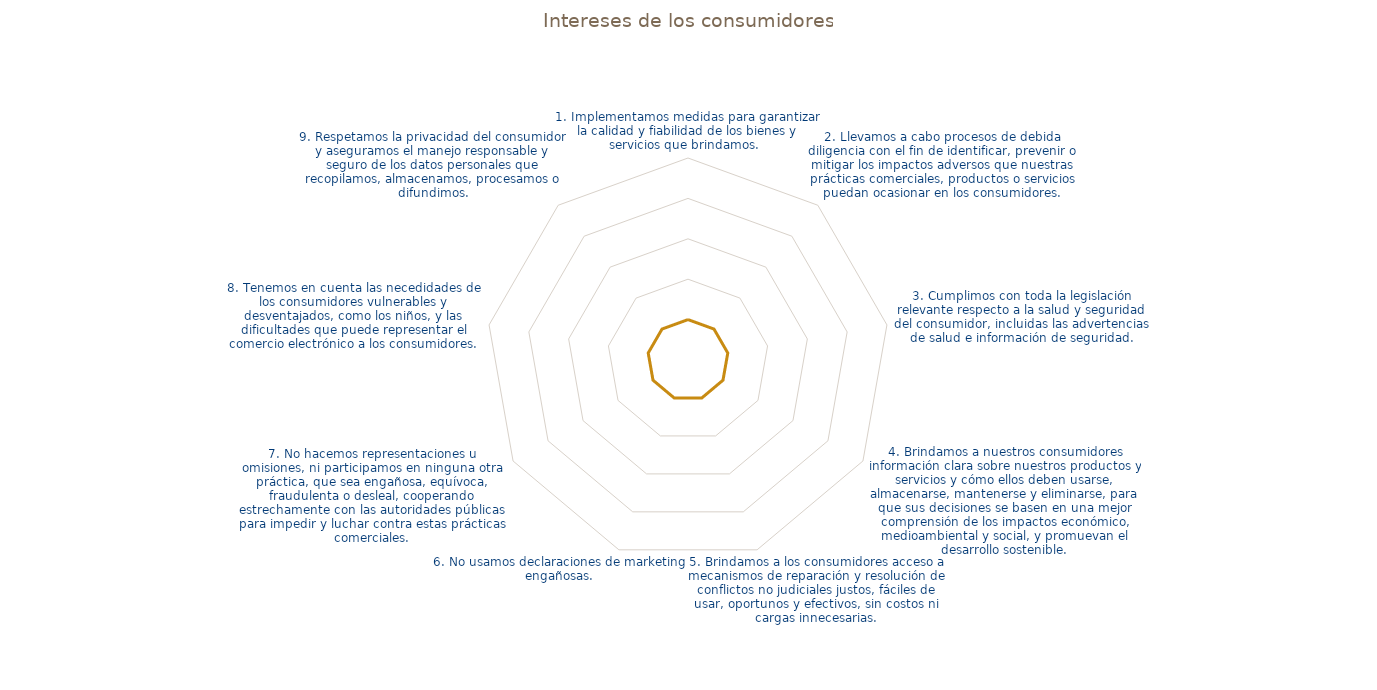
| Category | Series 0 |
|---|---|
| 1. Implementamos medidas para garantizar la calidad y fiabilidad de los bienes y servicios que brindamos.   | 1 |
| 2. Llevamos a cabo procesos de debida diligencia con el fin de identificar, prevenir o mitigar los impactos adversos que nuestras prácticas comerciales, productos o servicios puedan ocasionar en los consumidores. | 1 |
| 3. Cumplimos con toda la legislación relevante respecto a la salud y seguridad del consumidor, incluidas las advertencias de salud e información de seguridad. | 1 |
| 4. Brindamos a nuestros consumidores información clara sobre nuestros productos y servicios y cómo ellos deben usarse, almacenarse, mantenerse y eliminarse, para que sus decisiones se basen en una mejor comprensión de los impactos económico, medioambiental | 1 |
| 5. Brindamos a los consumidores acceso a mecanismos de reparación y resolución de conflictos no judiciales justos, fáciles de usar, oportunos y efectivos, sin costos ni cargas innecesarias. | 1 |
| 6. No usamos declaraciones de marketing engañosas. | 1 |
| 7. No hacemos representaciones u omisiones, ni participamos en ninguna otra práctica, que sea engañosa, equívoca, fraudulenta o desleal, cooperando estrechamente con las autoridades públicas para impedir y luchar contra estas prácticas comerciales. | 1 |
| 8. Tenemos en cuenta las necedidades de los consumidores vulnerables y desventajados, como los niños, y las dificultades que puede representar el comercio electrónico a los consumidores. | 1 |
| 9. Respetamos la privacidad del consumidor y aseguramos el manejo responsable y seguro de los datos personales que recopilamos, almacenamos, procesamos o difundimos. | 1 |